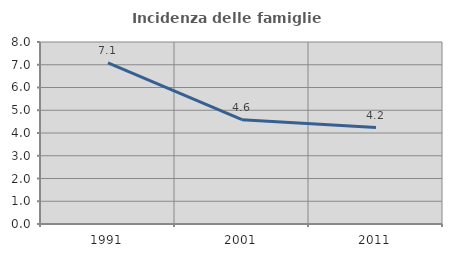
| Category | Incidenza delle famiglie numerose |
|---|---|
| 1991.0 | 7.08 |
| 2001.0 | 4.587 |
| 2011.0 | 4.237 |